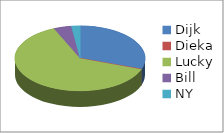
| Category | Series 0 | Series 1 |
|---|---|---|
| Dijk | 14 | 0.304 |
| Dieka | 0 | 0 |
| Lucky | 29 | 0.63 |
| Bill | 2 | 0.044 |
| NY | 1 | 0.022 |